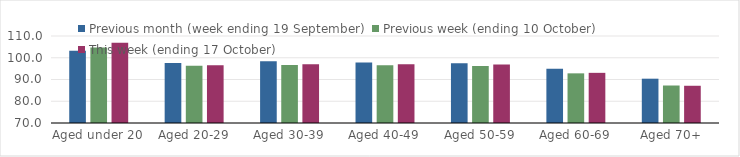
| Category | Previous month (week ending 19 September) | Previous week (ending 10 October) | This week (ending 17 October) |
|---|---|---|---|
| Aged under 20 | 103.27 | 104.69 | 106.89 |
| Aged 20-29 | 97.58 | 96.32 | 96.59 |
| Aged 30-39 | 98.38 | 96.71 | 97.02 |
| Aged 40-49 | 97.85 | 96.5 | 96.97 |
| Aged 50-59 | 97.47 | 96.18 | 96.84 |
| Aged 60-69 | 94.94 | 92.83 | 93.06 |
| Aged 70+ | 90.37 | 87.24 | 87.12 |